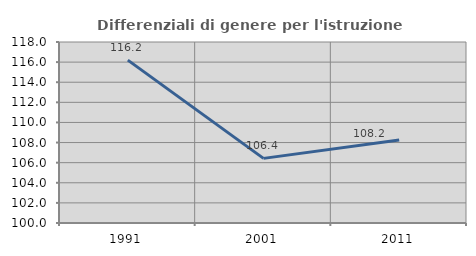
| Category | Differenziali di genere per l'istruzione superiore |
|---|---|
| 1991.0 | 116.195 |
| 2001.0 | 106.426 |
| 2011.0 | 108.247 |